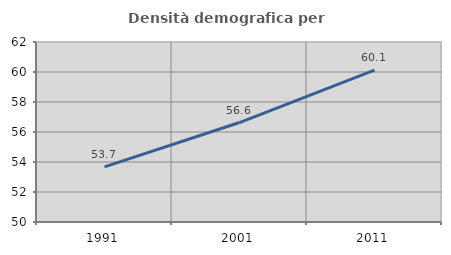
| Category | Densità demografica |
|---|---|
| 1991.0 | 53.679 |
| 2001.0 | 56.632 |
| 2011.0 | 60.121 |